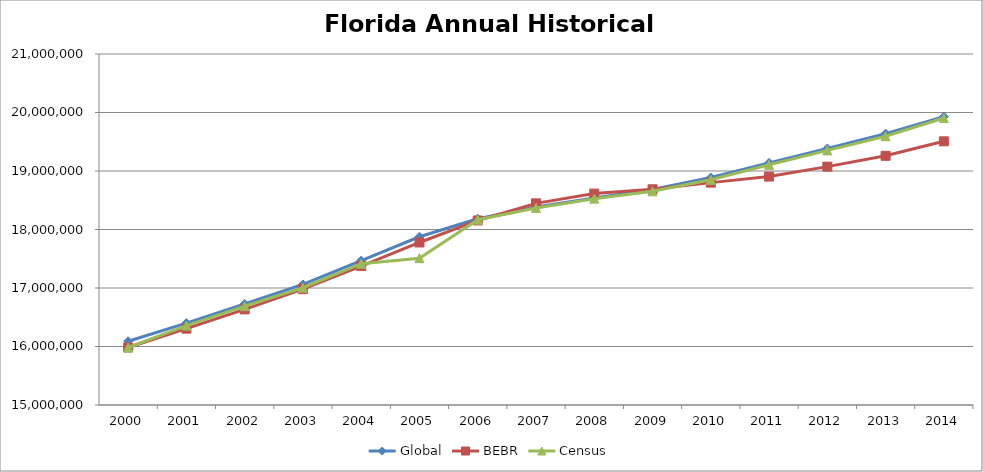
| Category | Global | BEBR | Census |
|---|---|---|---|
| 2000-01-01 | 16088978.056 | 15982824 | 15982571 |
| 2001-01-01 | 16399446.867 | 16305100 | 16356966 |
| 2002-01-01 | 16727125.504 | 16634256 | 16689370 |
| 2003-01-01 | 17060846.536 | 16979706 | 17004085 |
| 2004-01-01 | 17468830.749 | 17374824 | 17415318 |
| 2005-01-01 | 17875733.378 | 17778156 | 17509827 |
| 2006-01-01 | 18184081.858 | 18154475 | 18166990 |
| 2007-01-01 | 18385060.896 | 18446768 | 18367842 |
| 2008-01-01 | 18540761.091 | 18613905 | 18527305 |
| 2009-01-01 | 18682785.245 | 18687425 | 18652644 |
| 2010-01-01 | 18888260.75 | 18801332 | 18849890 |
| 2011-01-01 | 19138125.527 | 18905070 | 19105533 |
| 2012-01-01 | 19385501.633 | 19074434 | 19352021 |
| 2013-01-01 | 19639620.056 | 19259543 | 19594467 |
| 2014-01-01 | 19929392.636 | 19507369 | 19905569 |